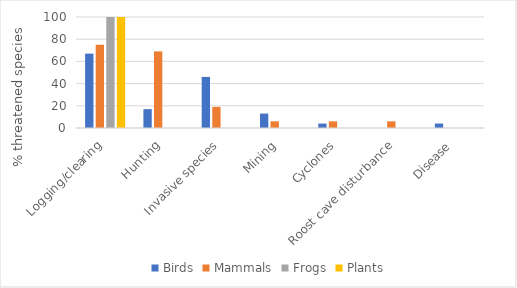
| Category | Birds | Mammals | Frogs | Plants |
|---|---|---|---|---|
| Logging/clearing | 67 | 75 | 100 | 100 |
| Hunting | 17 | 69 | 0 | 0 |
| Invasive species | 46 | 19 | 0 | 0 |
| Mining | 13 | 6 | 0 | 0 |
| Cyclones | 4 | 6 | 0 | 0 |
| Roost cave disturbance | 0 | 6 | 0 | 0 |
| Disease | 4 | 0 | 0 | 0 |